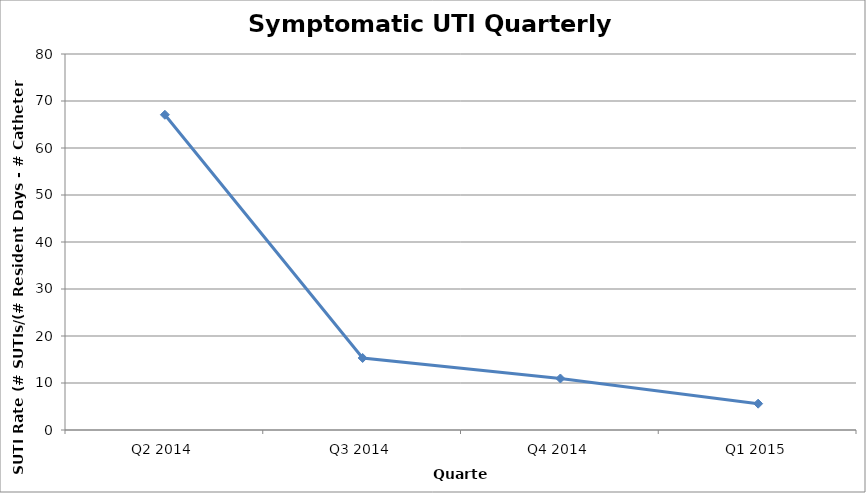
| Category | Series 0 |
|---|---|
| Q2 2014 | 67.073 |
| Q3 2014 | 15.326 |
| Q4 2014 | 10.959 |
| Q1 2015 | 5.602 |